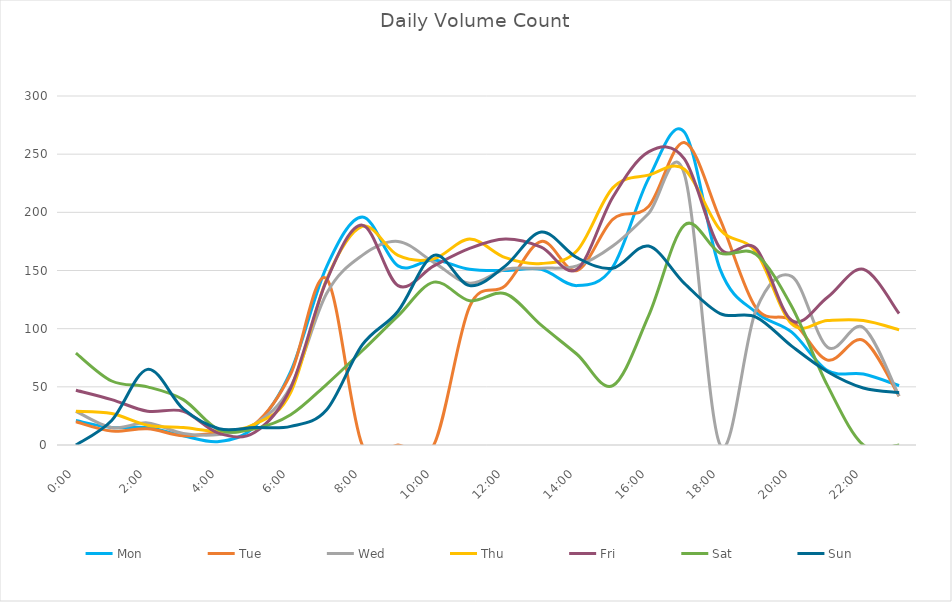
| Category | Mon | Tue | Wed | Thu | Fri | Sat | Sun |
|---|---|---|---|---|---|---|---|
| 0.0 | 21 | 20 | 29 | 29 | 47 | 79 | 0 |
| 0.0416666666666667 | 15 | 12 | 15 | 27 | 39 | 55 | 21 |
| 0.0833333333333333 | 15 | 14 | 19 | 17 | 29 | 50 | 65 |
| 0.125 | 8 | 8 | 10 | 15 | 29 | 39 | 31 |
| 0.166666666666667 | 3 | 11 | 9 | 12 | 10 | 13 | 14 |
| 0.208333333333333 | 16 | 18 | 18 | 18 | 11 | 14 | 15 |
| 0.25 | 63 | 61 | 50 | 45 | 49 | 26 | 16 |
| 0.291666666666667 | 153 | 143 | 130 | 142 | 141 | 52 | 30 |
| 0.333333333333333 | 196 | 0 | 163 | 188 | 189 | 81 | 86 |
| 0.375 | 154 | 0 | 175 | 163 | 137 | 111 | 115 |
| 0.416666666666667 | 159 | 0 | 157 | 160 | 154 | 140 | 163 |
| 0.4583333333333333 | 151 | 119 | 139 | 177 | 169 | 124 | 137 |
| 0.5 | 150 | 137 | 151 | 161 | 177 | 130 | 154 |
| 0.541666666666667 | 151 | 175 | 152 | 156 | 170 | 103 | 183 |
| 0.5833333333333334 | 137 | 150 | 154 | 167 | 151 | 78 | 161 |
| 0.625 | 153 | 194 | 171 | 221 | 213 | 51 | 152 |
| 0.666666666666667 | 229 | 205 | 199 | 232 | 252 | 111 | 171 |
| 0.7083333333333334 | 269 | 260 | 233 | 237 | 246 | 189 | 139 |
| 0.75 | 151 | 194 | 0 | 185 | 169 | 165 | 113 |
| 0.791666666666667 | 114 | 118 | 116 | 166 | 169 | 164 | 110 |
| 0.8333333333333334 | 97 | 107 | 145 | 104 | 107 | 119 | 85 |
| 0.875 | 64 | 73 | 84 | 107 | 127 | 51 | 63 |
| 0.916666666666667 | 61 | 90 | 101 | 107 | 151 | 0 | 49 |
| 0.9583333333333334 | 51 | 42 | 42 | 99 | 113 | 0 | 45 |